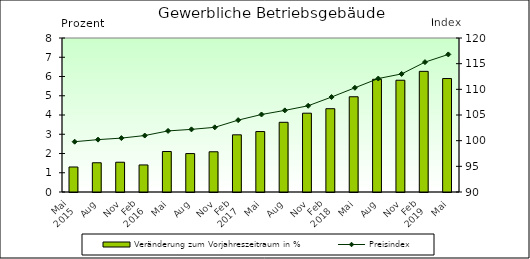
| Category | Veränderung zum Vorjahreszeitraum in % |
|---|---|
| 0 | 1.299 |
| 1 | 1.519 |
| 2 | 1.546 |
| 3 | 1.406 |
| 4 | 2.104 |
| 5 | 1.996 |
| 6 | 2.09 |
| 7 | 2.97 |
| 8 | 3.14 |
| 9 | 3.62 |
| 10 | 4.094 |
| 11 | 4.327 |
| 12 | 4.948 |
| 13 | 5.855 |
| 14 | 5.805 |
| 15 | 6.267 |
| 16 | 5.893 |